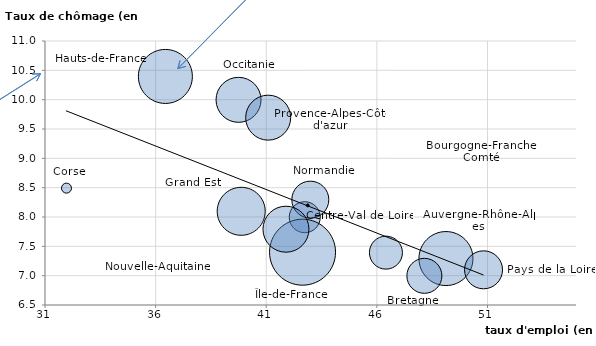
| Category | taux de chômage |
|---|---|
| 49.1 | 7.3 |
| 46.39 | 7.4 |
| 48.14 | 7 |
| 42.73 | 8 |
| 31.95 | 8.5 |
| 39.86 | 8.1 |
| 36.43 | 10.4 |
| 42.64 | 7.4 |
| 42.98 | 8.3 |
| 41.87 | 7.8 |
| 39.74 | 10 |
| 50.82 | 7.1 |
| 41.07 | 9.7 |
| 42.8689108202772 | 8.2 |